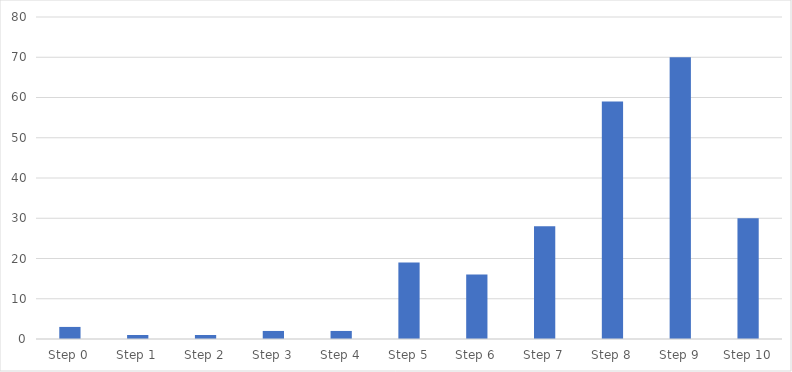
| Category | Number of Responses |
|---|---|
| Step 0 | 3 |
| Step 1 | 1 |
| Step 2 | 1 |
| Step 3 | 2 |
| Step 4 | 2 |
| Step 5 | 19 |
| Step 6 | 16 |
| Step 7 | 28 |
| Step 8 | 59 |
| Step 9 | 70 |
| Step 10 | 30 |